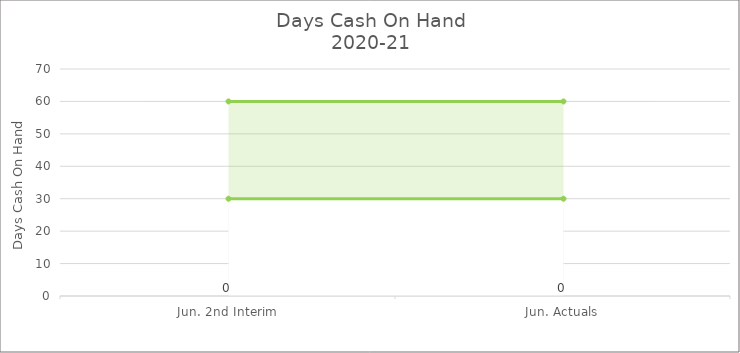
| Category | Days Cash on Hand |
|---|---|
| Jun. 2nd Interim | 0 |
| Jun. Actuals | 0 |